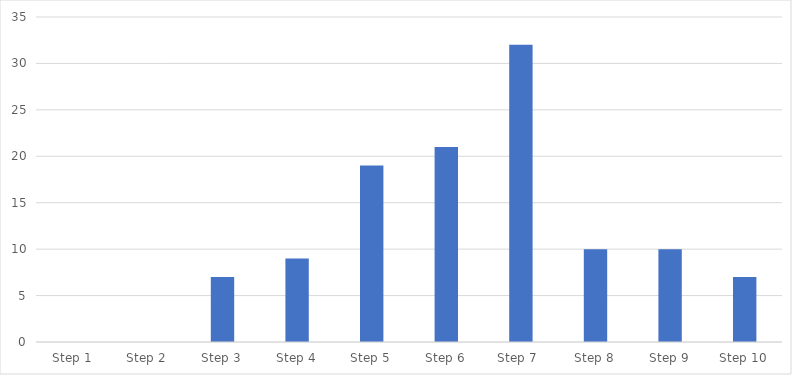
| Category | Number of Responses |
|---|---|
| Step 1 | 0 |
| Step 2 | 0 |
| Step 3 | 7 |
| Step 4 | 9 |
| Step 5 | 19 |
| Step 6 | 21 |
| Step 7  | 32 |
| Step 8 | 10 |
| Step 9 | 10 |
| Step 10 | 7 |